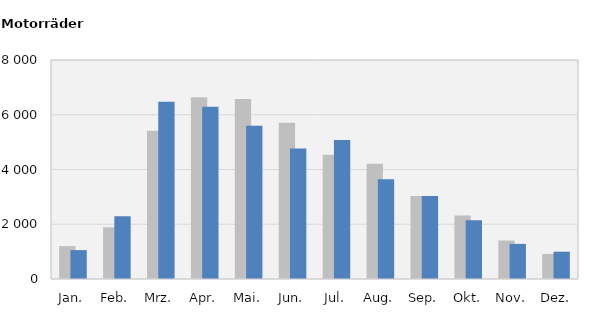
| Category | 2018 | 2019 |
|---|---|---|
| Jan. | 1201 | 1056 |
| Feb. | 1887 | 2291 |
| Mrz. | 5418 | 6473 |
| Apr. | 6639 | 6294 |
| Mai. | 6579 | 5602 |
| Jun. | 5705 | 4763 |
| Jul. | 4543 | 5076 |
| Aug. | 4210 | 3642 |
| Sep. | 3029 | 3033 |
| Okt. | 2322 | 2144 |
| Nov. | 1406 | 1283 |
| Dez. | 916 | 997 |